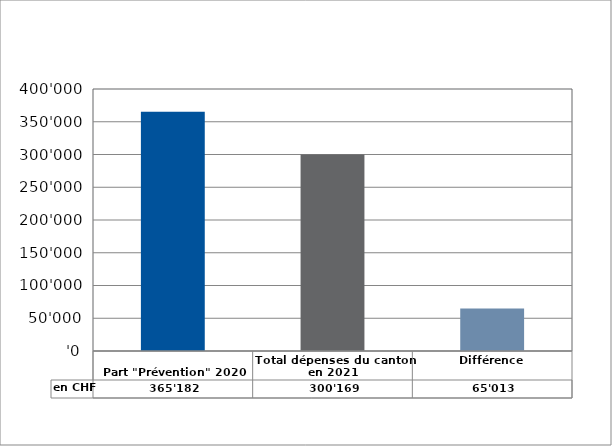
| Category | en CHF |
|---|---|
| 
Part "Prévention" 2020

 | 365182 |
| Total dépenses du canton en 2021 | 300168.58 |
| Différence | 65013.42 |